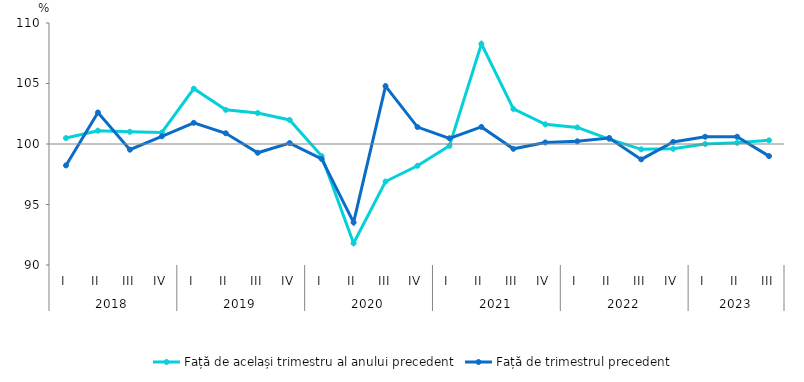
| Category | Față de același trimestru al anului precedent | Față de trimestrul precedent |
|---|---|---|
| 0 | 100.491 | 98.228 |
| 1 | 101.097 | 102.604 |
| 2 | 101.008 | 99.53 |
| 3 | 100.954 | 100.639 |
| 4 | 104.574 | 101.751 |
| 5 | 102.823 | 100.886 |
| 6 | 102.56 | 99.275 |
| 7 | 101.986 | 100.076 |
| 8 | 99 | 98.772 |
| 9 | 91.8 | 93.516 |
| 10 | 96.9 | 104.788 |
| 11 | 98.2 | 101.4 |
| 12 | 99.847 | 100.472 |
| 13 | 108.274 | 101.409 |
| 14 | 102.9 | 99.6 |
| 15 | 101.623 | 100.13 |
| 16 | 101.369 | 100.22 |
| 17 | 100.4 | 100.5 |
| 18 | 99.559 | 98.729 |
| 19 | 99.601 | 100.173 |
| 20 | 100 | 100.6 |
| 21 | 100.1 | 100.6 |
| 22 | 100.3 | 99 |